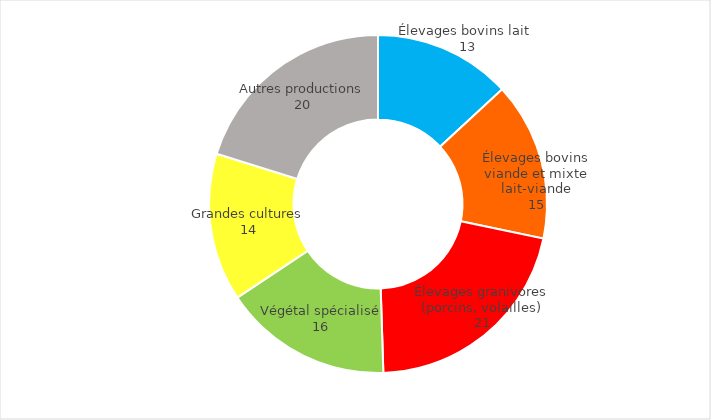
| Category | Series 0 |
|---|---|
| Élevages bovins lait  | 13 |
| Élevages bovins viande et mixte lait-viande | 15 |
| Élevages granivores (porcins, volailles) | 21 |
| Végétal spécialisé | 16 |
| Grandes cultures | 14 |
| Autres productions | 20 |